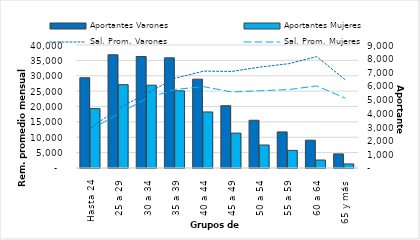
| Category | Aportantes Varones | Aportantes Mujeres |
|---|---|---|
| 0 | 6604 | 4349 |
| 1 | 8284 | 6099 |
| 2 | 8159 | 6060 |
| 3 | 8061 | 5648 |
| 4 | 6499 | 4102 |
| 5 | 4558 | 2553 |
| 6 | 3492 | 1684 |
| 7 | 2641 | 1289 |
| 8 | 2034 | 584 |
| 9 | 1031 | 298 |